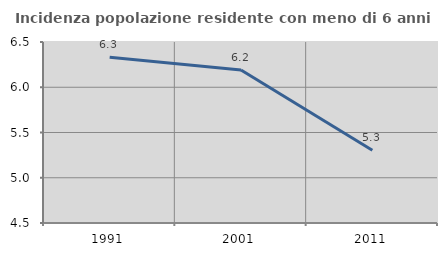
| Category | Incidenza popolazione residente con meno di 6 anni |
|---|---|
| 1991.0 | 6.331 |
| 2001.0 | 6.19 |
| 2011.0 | 5.303 |